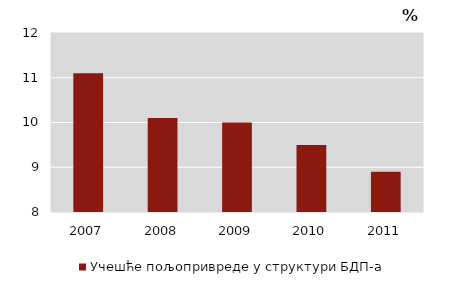
| Category | Учешће пољопривреде у структури БДП-а |
|---|---|
| 2007.0 | 11.1 |
| 2008.0 | 10.1 |
| 2009.0 | 10 |
| 2010.0 | 9.5 |
| 2011.0 | 8.9 |